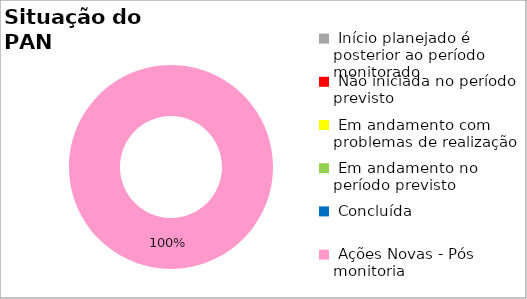
| Category | Series 0 |
|---|---|
|  Início planejado é posterior ao período monitorado | 0 |
|  Não iniciada no período previsto | 0 |
|  Em andamento com problemas de realização | 0 |
|  Em andamento no período previsto  | 0 |
|  Concluída | 0 |
|  Ações Novas - Pós monitoria | 1 |